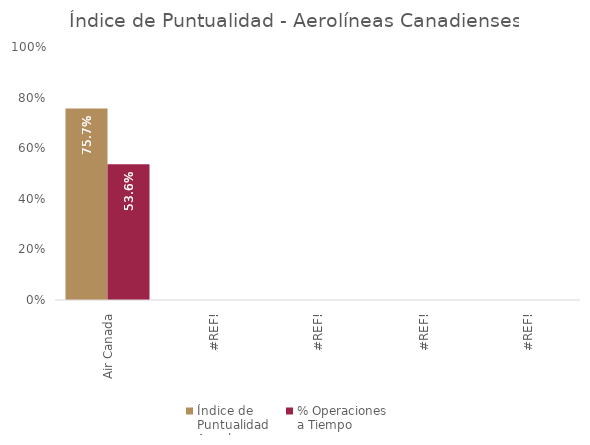
| Category | Índice de 
Puntualidad
Anual | % Operaciones 
a Tiempo |
|---|---|---|
| Air Canada | 0.757 | 0.536 |
| #¡REF! | 0 | 0 |
| #¡REF! | 0 | 0 |
| #¡REF! | 0 | 0 |
| #¡REF! | 0 | 0 |